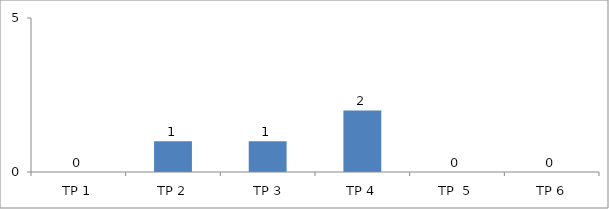
| Category | BIL. MURID |
|---|---|
| TP 1 | 0 |
| TP 2 | 1 |
|  TP 3 | 1 |
| TP 4 | 2 |
| TP  5 | 0 |
| TP 6 | 0 |